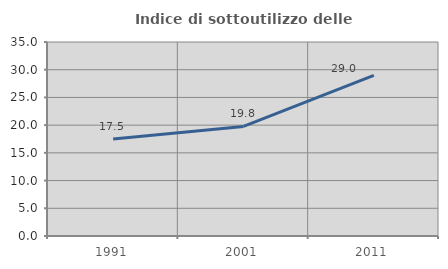
| Category | Indice di sottoutilizzo delle abitazioni  |
|---|---|
| 1991.0 | 17.5 |
| 2001.0 | 19.769 |
| 2011.0 | 28.984 |